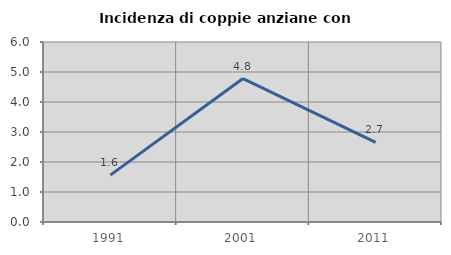
| Category | Incidenza di coppie anziane con figli |
|---|---|
| 1991.0 | 1.562 |
| 2001.0 | 4.782 |
| 2011.0 | 2.657 |